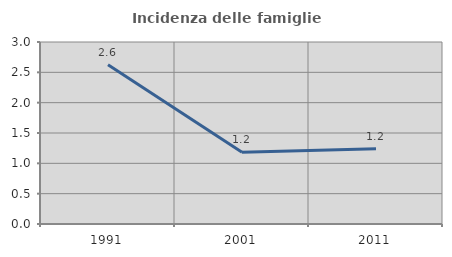
| Category | Incidenza delle famiglie numerose |
|---|---|
| 1991.0 | 2.626 |
| 2001.0 | 1.181 |
| 2011.0 | 1.241 |